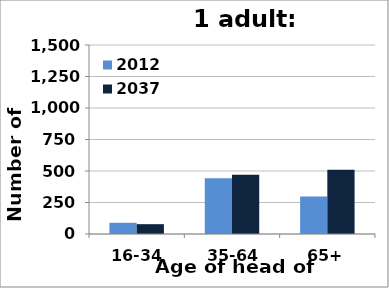
| Category | 2012 | 2037 |
|---|---|---|
| 16-34 | 89 | 78 |
| 35-64 | 443 | 471 |
| 65+ | 298 | 510 |